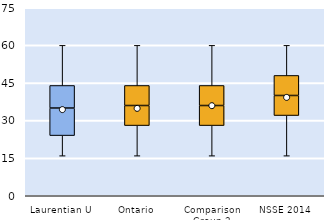
| Category | 25th | 50th | 75th |
|---|---|---|---|
| Laurentian U | 24 | 11 | 9 |
| Ontario | 28 | 8 | 8 |
| Comparison Group 2 | 28 | 8 | 8 |
| NSSE 2014 | 32 | 8 | 8 |